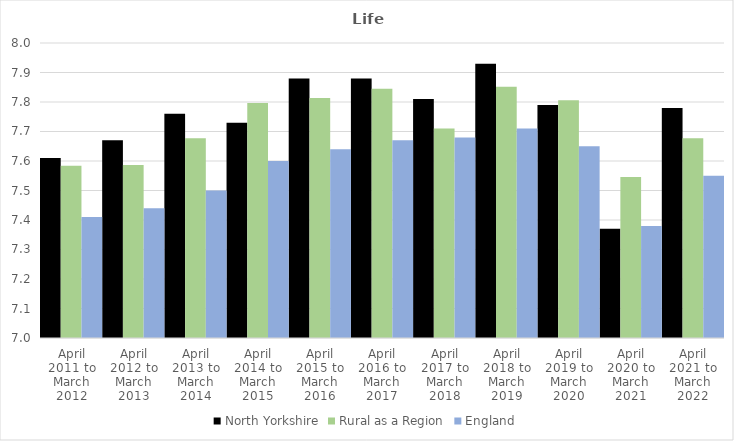
| Category | North Yorkshire | Rural as a Region | England |
|---|---|---|---|
| April 2011 to March 2012 | 7.61 | 7.584 | 7.41 |
| April 2012 to March 2013 | 7.67 | 7.586 | 7.44 |
| April 2013 to March 2014 | 7.76 | 7.677 | 7.5 |
| April 2014 to March 2015 | 7.73 | 7.797 | 7.6 |
| April 2015 to March 2016 | 7.88 | 7.813 | 7.64 |
| April 2016 to March 2017 | 7.88 | 7.845 | 7.67 |
| April 2017 to March 2018 | 7.81 | 7.71 | 7.68 |
| April 2018 to March 2019 | 7.93 | 7.852 | 7.71 |
| April 2019 to March 2020 | 7.79 | 7.806 | 7.65 |
| April 2020 to March 2021 | 7.37 | 7.546 | 7.38 |
| April 2021 to March 2022 | 7.78 | 7.677 | 7.55 |